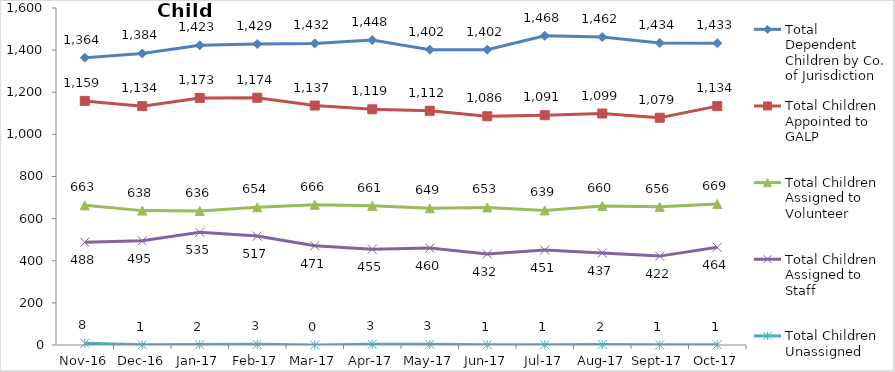
| Category | Total Dependent Children by Co. of Jurisdiction | Total Children Appointed to GALP | Total Children Assigned to Volunteer | Total Children Assigned to Staff | Total Children Unassigned |
|---|---|---|---|---|---|
| 2016-11-01 | 1364 | 1159 | 663 | 488 | 8 |
| 2016-12-01 | 1384 | 1134 | 638 | 495 | 1 |
| 2017-01-01 | 1423 | 1173 | 636 | 535 | 2 |
| 2017-02-01 | 1429 | 1174 | 654 | 517 | 3 |
| 2017-03-01 | 1432 | 1137 | 666 | 471 | 0 |
| 2017-04-01 | 1448 | 1119 | 661 | 455 | 3 |
| 2017-05-01 | 1402 | 1112 | 649 | 460 | 3 |
| 2017-06-01 | 1402 | 1086 | 653 | 432 | 1 |
| 2017-07-01 | 1468 | 1091 | 639 | 451 | 1 |
| 2017-08-01 | 1462 | 1099 | 660 | 437 | 2 |
| 2017-09-01 | 1434 | 1079 | 656 | 422 | 1 |
| 2017-10-01 | 1433 | 1134 | 669 | 464 | 1 |